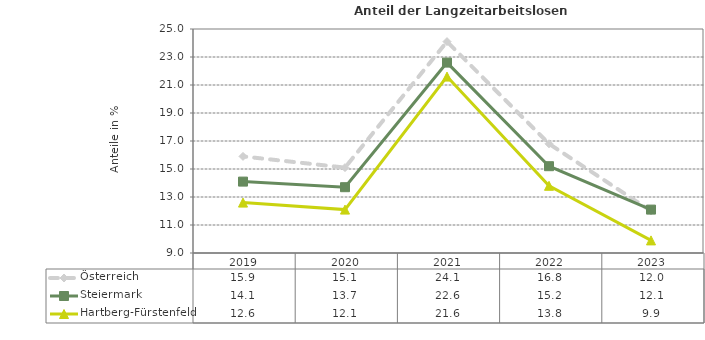
| Category | Österreich | Steiermark | Hartberg-Fürstenfeld |
|---|---|---|---|
| 2023.0 | 12 | 12.1 | 9.9 |
| 2022.0 | 16.8 | 15.2 | 13.8 |
| 2021.0 | 24.1 | 22.6 | 21.6 |
| 2020.0 | 15.1 | 13.7 | 12.1 |
| 2019.0 | 15.9 | 14.1 | 12.6 |